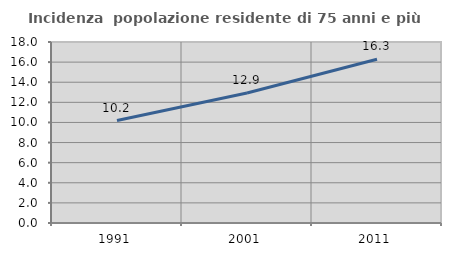
| Category | Incidenza  popolazione residente di 75 anni e più |
|---|---|
| 1991.0 | 10.19 |
| 2001.0 | 12.925 |
| 2011.0 | 16.279 |